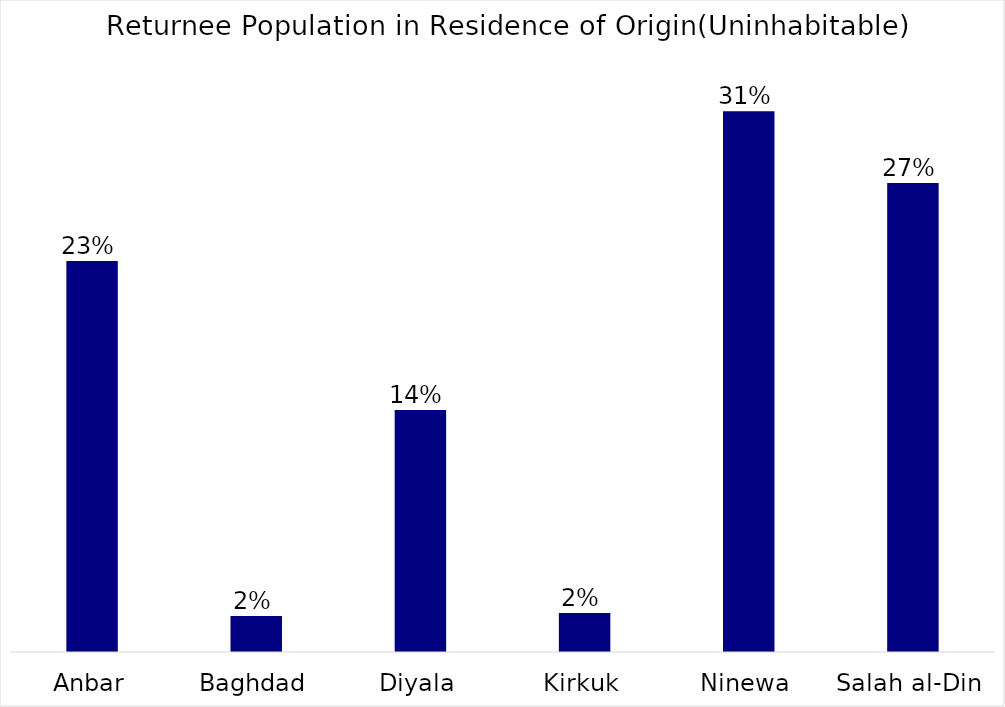
| Category | Series 0 |
|---|---|
| Anbar | 0.227 |
| Baghdad | 0.021 |
| Diyala | 0.141 |
| Kirkuk | 0.023 |
| Ninewa | 0.314 |
| Salah al-Din | 0.273 |